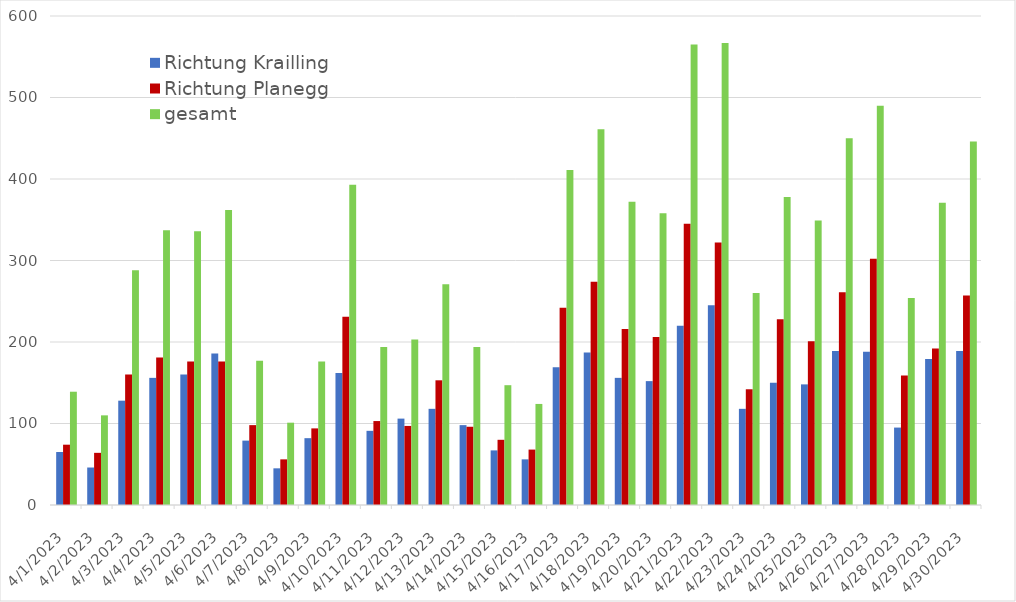
| Category | Richtung Krailling | Richtung Planegg | gesamt |
|---|---|---|---|
| 4/1/23 | 65 | 74 | 139 |
| 4/2/23 | 46 | 64 | 110 |
| 4/3/23 | 128 | 160 | 288 |
| 4/4/23 | 156 | 181 | 337 |
| 4/5/23 | 160 | 176 | 336 |
| 4/6/23 | 186 | 176 | 362 |
| 4/7/23 | 79 | 98 | 177 |
| 4/8/23 | 45 | 56 | 101 |
| 4/9/23 | 82 | 94 | 176 |
| 4/10/23 | 162 | 231 | 393 |
| 4/11/23 | 91 | 103 | 194 |
| 4/12/23 | 106 | 97 | 203 |
| 4/13/23 | 118 | 153 | 271 |
| 4/14/23 | 98 | 96 | 194 |
| 4/15/23 | 67 | 80 | 147 |
| 4/16/23 | 56 | 68 | 124 |
| 4/17/23 | 169 | 242 | 411 |
| 4/18/23 | 187 | 274 | 461 |
| 4/19/23 | 156 | 216 | 372 |
| 4/20/23 | 152 | 206 | 358 |
| 4/21/23 | 220 | 345 | 565 |
| 4/22/23 | 245 | 322 | 567 |
| 4/23/23 | 118 | 142 | 260 |
| 4/24/23 | 150 | 228 | 378 |
| 4/25/23 | 148 | 201 | 349 |
| 4/26/23 | 189 | 261 | 450 |
| 4/27/23 | 188 | 302 | 490 |
| 4/28/23 | 95 | 159 | 254 |
| 4/29/23 | 179 | 192 | 371 |
| 4/30/23 | 189 | 257 | 446 |